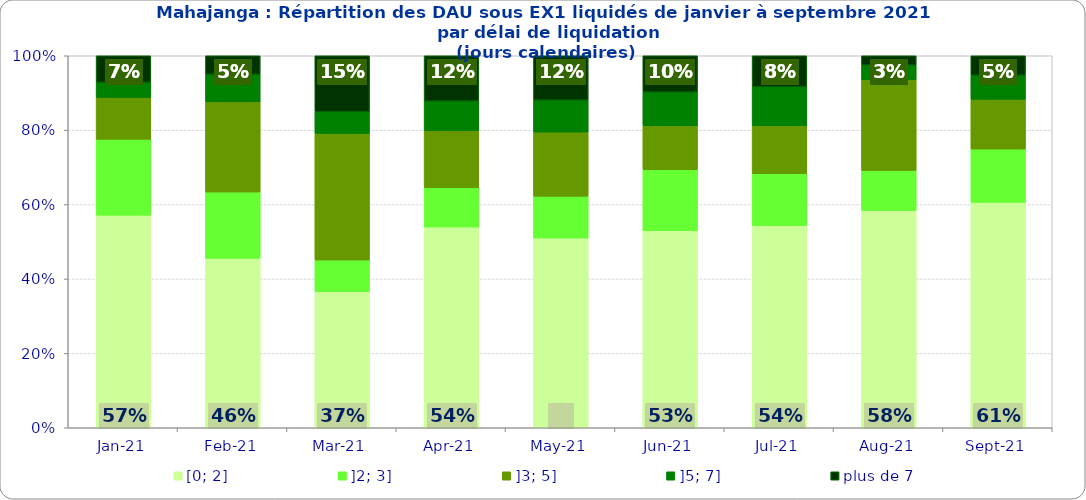
| Category | [0; 2] | ]2; 3] | ]3; 5] | ]5; 7] | plus de 7 |
|---|---|---|---|---|---|
| 2021-01-01 | 0.571 | 0.204 | 0.112 | 0.041 | 0.071 |
| 2021-02-01 | 0.455 | 0.178 | 0.243 | 0.074 | 0.05 |
| 2021-03-01 | 0.366 | 0.085 | 0.34 | 0.059 | 0.15 |
| 2021-04-01 | 0.54 | 0.106 | 0.153 | 0.079 | 0.122 |
| 2021-05-01 | 0.51 | 0.113 | 0.172 | 0.086 | 0.119 |
| 2021-06-01 | 0.53 | 0.164 | 0.118 | 0.091 | 0.098 |
| 2021-07-01 | 0.544 | 0.139 | 0.129 | 0.105 | 0.084 |
| 2021-08-01 | 0.584 | 0.108 | 0.244 | 0.039 | 0.025 |
| 2021-09-01 | 0.606 | 0.143 | 0.134 | 0.065 | 0.052 |